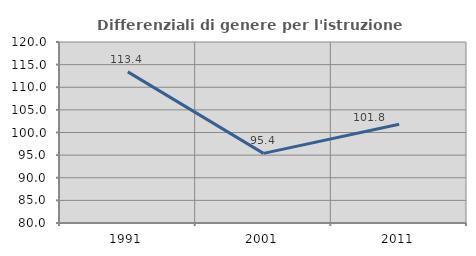
| Category | Differenziali di genere per l'istruzione superiore |
|---|---|
| 1991.0 | 113.393 |
| 2001.0 | 95.387 |
| 2011.0 | 101.84 |